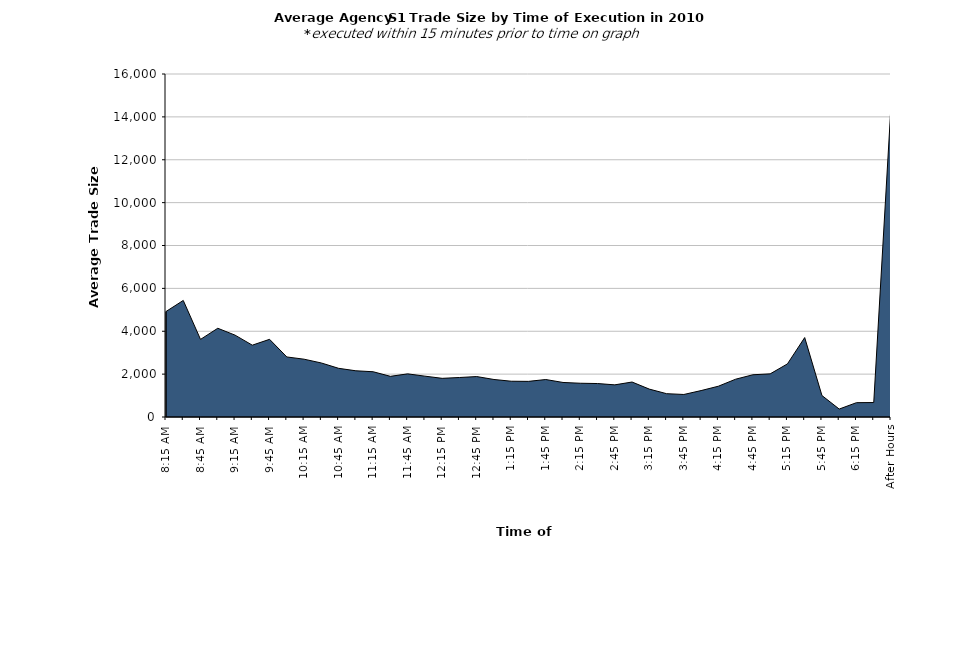
| Category | Series 0 |
|---|---|
| 8:15 AM | 4920.395 |
| 8:30 AM | 5436.839 |
| 8:45 AM | 3620.889 |
| 9:00 AM | 4139.496 |
| 9:15 AM | 3818.815 |
| 9:30 AM | 3350.896 |
| 9:45 AM | 3623.688 |
| 10:00 AM | 2800.363 |
| 10:15 AM | 2696.738 |
| 10:30 AM | 2520.09 |
| 10:45 AM | 2270.863 |
| 11:00 AM | 2155.395 |
| 11:15 AM | 2111.363 |
| 11:30 AM | 1896.708 |
| 11:45 AM | 2012.252 |
| 12:00 PM | 1905.693 |
| 12:15 PM | 1803.214 |
| 12:30 PM | 1842.338 |
| 12:45 PM | 1886.591 |
| 1:00 PM | 1749.797 |
| 1:15 PM | 1668.619 |
| 1:30 PM | 1662.236 |
| 1:45 PM | 1748.438 |
| 2:00 PM | 1611.108 |
| 2:15 PM | 1574.497 |
| 2:30 PM | 1560.989 |
| 2:45 PM | 1499.296 |
| 3:00 PM | 1631.339 |
| 3:15 PM | 1300.593 |
| 3:30 PM | 1088.184 |
| 3:45 PM | 1050.658 |
| 4:00 PM | 1232.659 |
| 4:15 PM | 1436.561 |
| 4:30 PM | 1763.224 |
| 4:45 PM | 1970.772 |
| 5:00 PM | 2011.667 |
| 5:15 PM | 2476.973 |
| 5:30 PM | 3705.169 |
| 5:45 PM | 1001.483 |
| 6:00 PM | 370.967 |
| 6:15 PM | 668.738 |
| 6:30 PM | 674.482 |
| After Hours | 14534.287 |